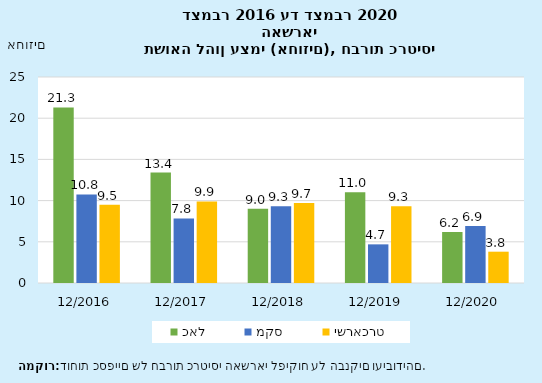
| Category | כאל | מקס | ישראכרט |
|---|---|---|---|
| 2016-12-31 | 21.3 | 10.75 | 9.5 |
| 2017-12-31 | 13.4 | 7.84 | 9.9 |
| 2018-12-31 | 9 | 9.31 | 9.7 |
| 2019-12-31 | 11 | 4.69 | 9.3 |
| 2020-12-31 | 6.2 | 6.91 | 3.8 |